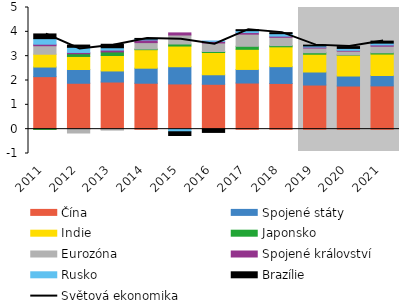
| Category | Čína | Spojené státy | Indie | Japonsko | Eurozóna | Spojené království | Rusko | Brazílie |
|---|---|---|---|---|---|---|---|---|
| 2011.0 | 2.158 | 0.395 | 0.527 | -0.009 | 0.349 | 0.063 | 0.228 | 0.194 |
| 2012.0 | 1.886 | 0.566 | 0.536 | 0.11 | -0.157 | 0.054 | 0.212 | 0.092 |
| 2013.0 | 1.938 | 0.455 | 0.636 | 0.146 | -0.039 | 0.076 | 0.096 | 0.143 |
| 2014.0 | 1.888 | 0.618 | 0.761 | 0.026 | 0.264 | 0.109 | 0.04 | 0.023 |
| 2015.0 | 1.859 | 0.707 | 0.85 | 0.084 | 0.37 | 0.086 | -0.107 | -0.153 |
| 2016.0 | 1.845 | 0.392 | 0.914 | 0.041 | 0.352 | 0.064 | 0.015 | -0.133 |
| 2017.0 | 1.896 | 0.558 | 0.827 | 0.124 | 0.499 | 0.065 | 0.076 | 0.042 |
| 2018.0 | 1.88 | 0.689 | 0.816 | 0.049 | 0.342 | 0.048 | 0.101 | 0.043 |
| 2019.0 | 1.814 | 0.536 | 0.731 | 0.061 | 0.194 | 0.041 | 0.045 | 0.034 |
| 2020.0 | 1.773 | 0.411 | 0.855 | 0.012 | 0.155 | 0.033 | 0.079 | 0.074 |
| 2021.0 | 1.778 | 0.428 | 0.881 | 0.052 | 0.271 | 0.052 | 0.073 | 0.084 |